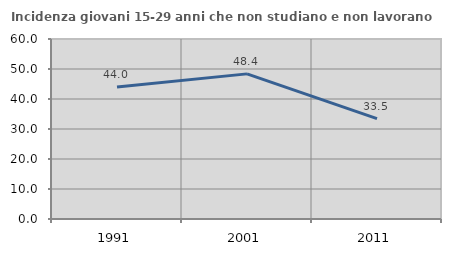
| Category | Incidenza giovani 15-29 anni che non studiano e non lavorano  |
|---|---|
| 1991.0 | 44.018 |
| 2001.0 | 48.375 |
| 2011.0 | 33.462 |